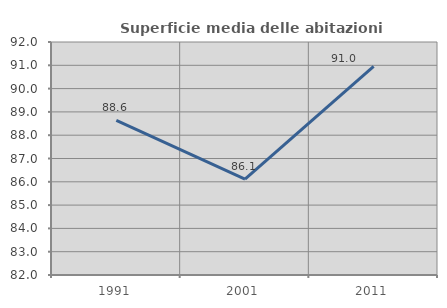
| Category | Superficie media delle abitazioni occupate |
|---|---|
| 1991.0 | 88.633 |
| 2001.0 | 86.119 |
| 2011.0 | 90.956 |